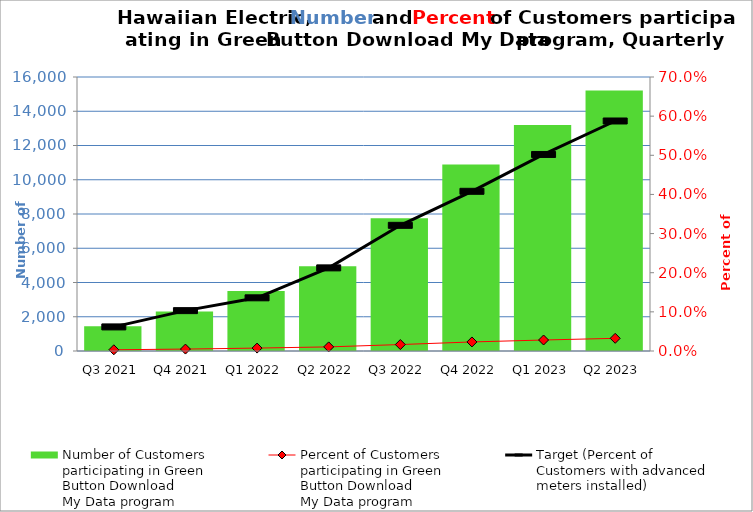
| Category | Number of Customers
participating in Green
Button Download
My Data program |
|---|---|
| Q3 2021 | 1450 |
| Q4 2021 | 2305 |
| Q1 2022 | 3503 |
| Q2 2022 | 4953 |
| Q3 2022 | 7758 |
| Q4 2022 | 10887 |
| Q1 2023 | 13192 |
| Q2 2023 | 15215 |